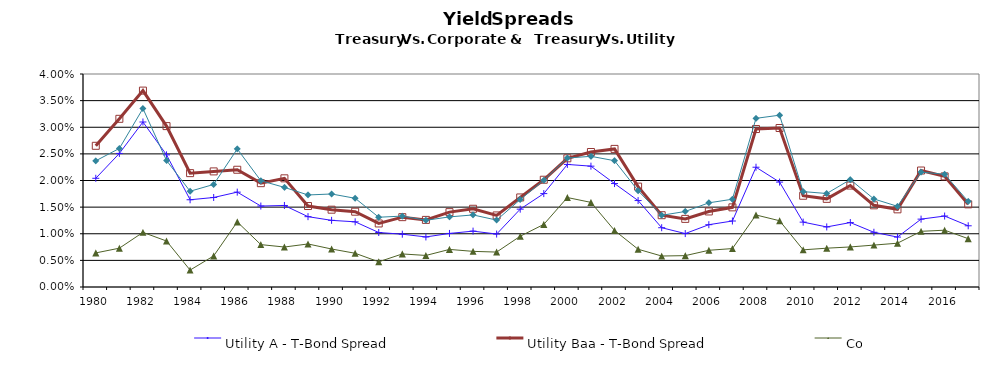
| Category | Utility A - T-Bond Spread | Utility Baa - T-Bond Spread | Corporate Aaa - T-Bond Spread | Corporate Baa - T-Bond Spread |
|---|---|---|---|---|
| 1980.0 | 0.02 | 0.027 | 0.006 | 0.024 |
| 1981.0 | 0.025 | 0.032 | 0.007 | 0.026 |
| 1982.0 | 0.031 | 0.037 | 0.01 | 0.034 |
| 1983.0 | 0.025 | 0.03 | 0.009 | 0.024 |
| 1984.0 | 0.016 | 0.021 | 0.003 | 0.018 |
| 1985.0 | 0.017 | 0.022 | 0.006 | 0.019 |
| 1986.0 | 0.018 | 0.022 | 0.012 | 0.026 |
| 1987.0 | 0.015 | 0.02 | 0.008 | 0.02 |
| 1988.0 | 0.015 | 0.02 | 0.008 | 0.019 |
| 1989.0 | 0.013 | 0.015 | 0.008 | 0.017 |
| 1990.0 | 0.013 | 0.015 | 0.007 | 0.017 |
| 1991.0 | 0.012 | 0.014 | 0.006 | 0.017 |
| 1992.0 | 0.01 | 0.012 | 0.005 | 0.013 |
| 1993.0 | 0.01 | 0.013 | 0.006 | 0.013 |
| 1994.0 | 0.009 | 0.013 | 0.006 | 0.013 |
| 1995.0 | 0.01 | 0.014 | 0.007 | 0.013 |
| 1996.0 | 0.01 | 0.015 | 0.007 | 0.014 |
| 1997.0 | 0.01 | 0.013 | 0.007 | 0.013 |
| 1998.0 | 0.015 | 0.017 | 0.01 | 0.016 |
| 1999.0 | 0.018 | 0.02 | 0.012 | 0.02 |
| 2000.0 | 0.023 | 0.024 | 0.017 | 0.024 |
| 2001.0 | 0.023 | 0.025 | 0.016 | 0.025 |
| 2002.0 | 0.019 | 0.026 | 0.011 | 0.024 |
| 2003.0 | 0.016 | 0.019 | 0.007 | 0.018 |
| 2004.0 | 0.011 | 0.013 | 0.006 | 0.013 |
| 2005.0 | 0.01 | 0.013 | 0.006 | 0.014 |
| 2006.0 | 0.012 | 0.014 | 0.007 | 0.016 |
| 2007.0 | 0.012 | 0.015 | 0.007 | 0.016 |
| 2008.0 | 0.022 | 0.03 | 0.014 | 0.032 |
| 2009.0 | 0.02 | 0.03 | 0.012 | 0.032 |
| 2010.0 | 0.012 | 0.017 | 0.007 | 0.018 |
| 2011.0 | 0.011 | 0.017 | 0.007 | 0.018 |
| 2012.0 | 0.012 | 0.019 | 0.008 | 0.02 |
| 2013.0 | 0.01 | 0.015 | 0.008 | 0.017 |
| 2014.0 | 0.009 | 0.015 | 0.008 | 0.015 |
| 2015.0 | 0.013 | 0.022 | 0.01 | 0.022 |
| 2016.0 | 0.013 | 0.021 | 0.011 | 0.021 |
| 2017.0 | 0.011 | 0.016 | 0.009 | 0.016 |